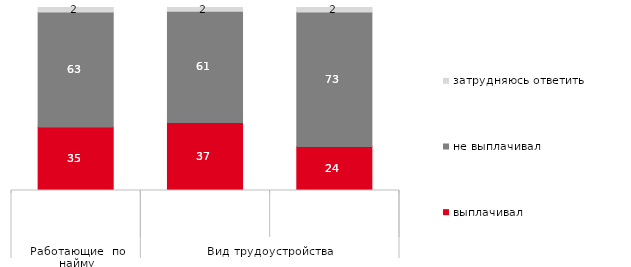
| Category | выплачивал | не выплачивал | затрудняюсь ответить |
|---|---|---|---|
| 0 | 34.766 | 62.751 | 2.483 |
| 1 | 37.199 | 60.735 | 2.067 |
| 2 | 24.074 | 73.457 | 2.469 |